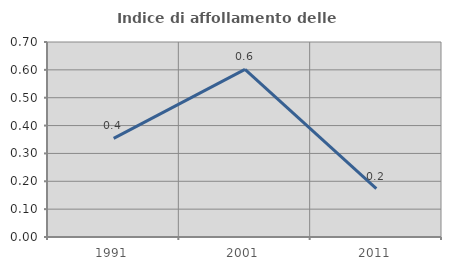
| Category | Indice di affollamento delle abitazioni  |
|---|---|
| 1991.0 | 0.354 |
| 2001.0 | 0.602 |
| 2011.0 | 0.174 |